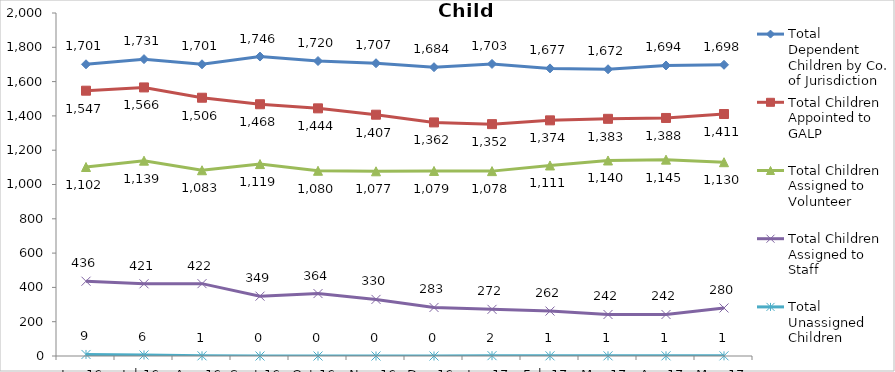
| Category | Total Dependent Children by Co. of Jurisdiction | Total Children Appointed to GALP | Total Children Assigned to Volunteer | Total Children Assigned to Staff | Total Unassigned Children |
|---|---|---|---|---|---|
| Jun-16 | 1701 | 1547 | 1102 | 436 | 9 |
| Jul-16 | 1731 | 1566 | 1139 | 421 | 6 |
| Aug-16 | 1701 | 1506 | 1083 | 422 | 1 |
| Sep-16 | 1746 | 1468 | 1119 | 349 | 0 |
| Oct-16 | 1720 | 1444 | 1080 | 364 | 0 |
| Nov-16 | 1707 | 1407 | 1077 | 330 | 0 |
| Dec-16 | 1684 | 1362 | 1079 | 283 | 0 |
| Jan-17 | 1703 | 1352 | 1078 | 272 | 2 |
| Feb-17 | 1677 | 1374 | 1111 | 262 | 1 |
| Mar-17 | 1672 | 1383 | 1140 | 242 | 1 |
| Apr-17 | 1694 | 1388 | 1145 | 242 | 1 |
| May-17 | 1698 | 1411 | 1130 | 280 | 1 |